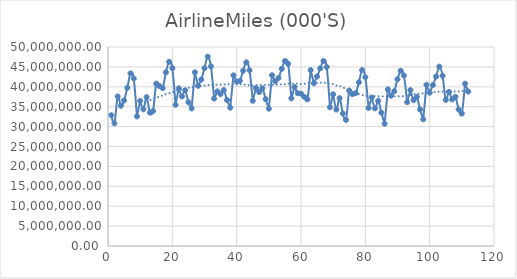
| Category | AirlineMiles (000'S) |
|---|---|
| 1.0 | 32854790 |
| 2.0 | 30814269 |
| 3.0 | 37586654 |
| 4.0 | 35226398 |
| 5.0 | 36569670 |
| 6.0 | 39750216 |
| 7.0 | 43367508 |
| 8.0 | 42092669 |
| 9.0 | 32549732 |
| 10.0 | 36442428 |
| 11.0 | 34350366 |
| 12.0 | 37389382 |
| 13.0 | 33537392 |
| 14.0 | 33909139 |
| 15.0 | 40805211 |
| 16.0 | 40172829 |
| 17.0 | 39671007 |
| 18.0 | 43652277 |
| 19.0 | 46262249 |
| 20.0 | 44701691 |
| 21.0 | 35470844 |
| 22.0 | 39627851 |
| 23.0 | 37567116 |
| 24.0 | 39117678 |
| 25.0 | 36117688 |
| 26.0 | 34560838 |
| 27.0 | 43642223 |
| 28.0 | 40244600 |
| 29.0 | 41801557 |
| 30.0 | 44676734 |
| 31.0 | 47563113 |
| 32.0 | 45135361 |
| 33.0 | 37044906 |
| 34.0 | 38849763 |
| 35.0 | 38158242 |
| 36.0 | 39176167 |
| 37.0 | 36677179 |
| 38.0 | 34745538 |
| 39.0 | 42892739 |
| 40.0 | 41296409 |
| 41.0 | 41489103 |
| 42.0 | 44025656 |
| 43.0 | 46157221 |
| 44.0 | 44152535 |
| 45.0 | 36489369 |
| 46.0 | 39684942 |
| 47.0 | 38673709 |
| 48.0 | 39616707 |
| 49.0 | 36918240 |
| 50.0 | 34504282 |
| 51.0 | 42899597 |
| 52.0 | 41367935 |
| 53.0 | 42213471 |
| 54.0 | 44496559 |
| 55.0 | 46468077 |
| 56.0 | 45760904 |
| 57.0 | 37075598 |
| 58.0 | 39961688 |
| 59.0 | 38386761 |
| 60.0 | 38287010 |
| 61.0 | 37492254 |
| 62.0 | 36855338 |
| 63.0 | 44201991 |
| 64.0 | 40888963 |
| 65.0 | 42591558 |
| 66.0 | 44660111 |
| 67.0 | 46490098 |
| 68.0 | 44969555 |
| 69.0 | 34883002 |
| 70.0 | 38128010 |
| 71.0 | 34270471 |
| 72.0 | 37156359 |
| 73.0 | 33303546 |
| 74.0 | 31687274 |
| 75.0 | 39056403 |
| 76.0 | 38136055 |
| 77.0 | 38408753 |
| 78.0 | 41145909 |
| 79.0 | 44215515 |
| 80.0 | 42397035 |
| 81.0 | 34675396 |
| 82.0 | 37318051 |
| 83.0 | 34576582 |
| 84.0 | 36459079 |
| 85.0 | 33487141 |
| 86.0 | 30718097 |
| 87.0 | 39369601 |
| 88.0 | 37762307 |
| 89.0 | 38883683 |
| 90.0 | 41901959 |
| 91.0 | 44021861 |
| 92.0 | 42813205 |
| 93.0 | 36131604 |
| 94.0 | 39183461 |
| 95.0 | 36671544 |
| 96.0 | 37426385 |
| 97.0 | 34327420 |
| 98.0 | 31825086 |
| 99.0 | 40506781 |
| 100.0 | 38505752 |
| 101.0 | 40429593 |
| 102.0 | 42570238 |
| 103.0 | 45074086 |
| 104.0 | 42782321 |
| 105.0 | 36698979 |
| 106.0 | 38703718 |
| 107.0 | 36827824 |
| 108.0 | 37493287 |
| 109.0 | 34313550 |
| 110.0 | 33264168 |
| 111.0 | 40781257 |
| 112.0 | 38806524 |